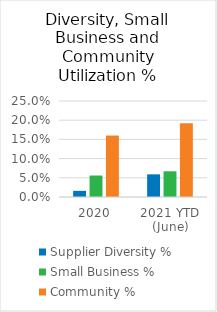
| Category | Supplier Diversity % | Small Business % | Community % |
|---|---|---|---|
| 2020 | 0.016 | 0.056 | 0.16 |
| 2021 YTD (June) | 0.059 | 0.067 | 0.192 |